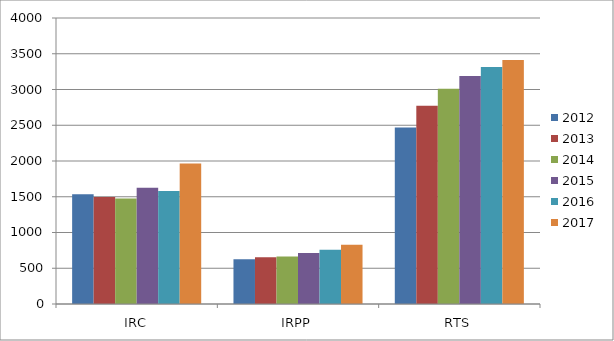
| Category | 2012 | 2013 | 2014 | 2015 | 2016 | 2017 |
|---|---|---|---|---|---|---|
| IRC | 1536 | 1496 | 1475 | 1625 | 1580 | 1966 |
| IRPP | 627 | 655 | 663 | 712 | 760 | 828 |
| RTS | 2470 | 2772 | 3012 | 3190 | 3315 | 3411 |